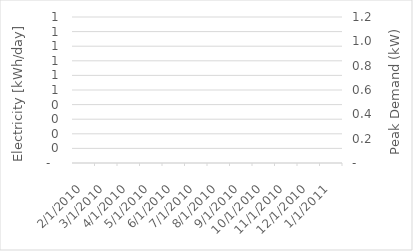
| Category | Series 1 |
|---|---|
| 2/1/10 | 0 |
| 3/1/10 | 0 |
| 4/1/10 | 0 |
| 5/1/10 | 0 |
| 6/1/10 | 0 |
| 7/1/10 | 0 |
| 8/1/10 | 0 |
| 9/1/10 | 0 |
| 10/1/10 | 0 |
| 11/1/10 | 0 |
| 12/1/10 | 0 |
| 1/1/11 | 0 |